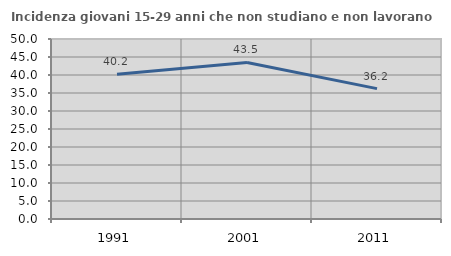
| Category | Incidenza giovani 15-29 anni che non studiano e non lavorano  |
|---|---|
| 1991.0 | 40.181 |
| 2001.0 | 43.496 |
| 2011.0 | 36.22 |